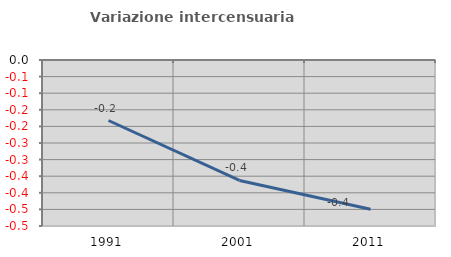
| Category | Variazione intercensuaria annua |
|---|---|
| 1991.0 | -0.182 |
| 2001.0 | -0.363 |
| 2011.0 | -0.45 |